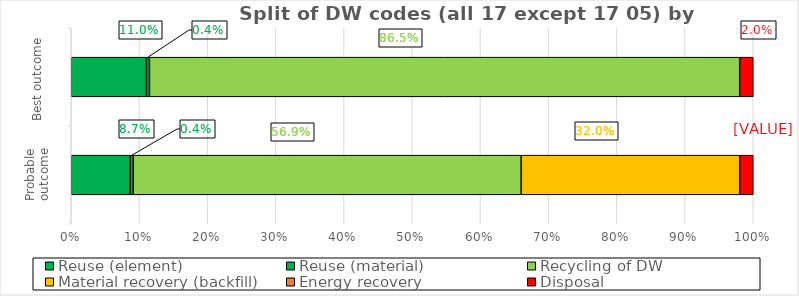
| Category | Reuse (element) | Reuse (material) | Recycling of DW | Material recovery (backfill) | Energy recovery | Disposal |
|---|---|---|---|---|---|---|
| Probable outcome | 0.087 | 0.004 | 0.569 | 0.32 | 0 | 0.02 |
| Best outcome | 0.11 | 0.004 | 0.865 | 0 | 0 | 0.02 |